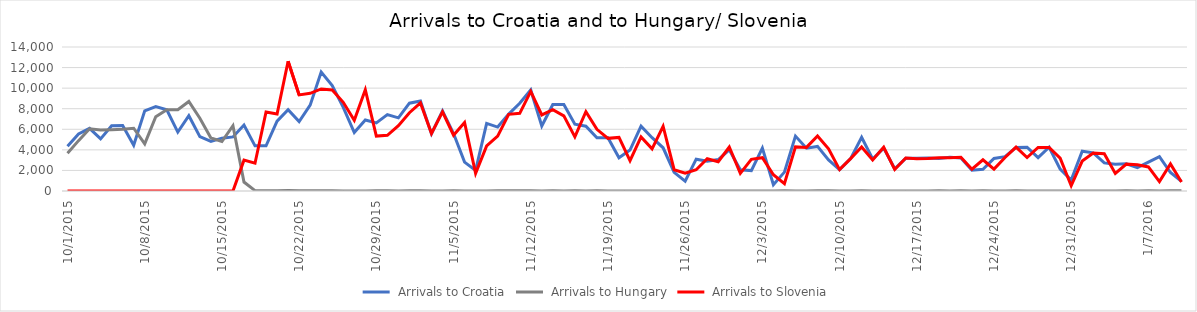
| Category | Arrivals to Croatia | Arrivals to Hungary | Arrivals to Slovenia |
|---|---|---|---|
| 10/1/15 | 4344 | 3667 | 0 |
| 10/2/15 | 5546 | 4897 | 0 |
| 10/3/15 | 6086 | 6056 | 0 |
| 10/4/15 | 5065 | 5925 | 0 |
| 10/5/15 | 6338 | 5952 | 0 |
| 10/6/15 | 6370 | 6000 | 0 |
| 10/7/15 | 4446 | 6103 | 0 |
| 10/8/15 | 7798 | 4583 | 6 |
| 10/9/15 | 8201 | 7215 | 0 |
| 10/10/15 | 7896 | 7907 | 0 |
| 10/11/15 | 5732 | 7897 | 0 |
| 10/12/15 | 7317 | 8702 | 0 |
| 10/13/15 | 5286 | 7081 | 0 |
| 10/14/15 | 4814 | 5157 | 0 |
| 10/15/15 | 5138 | 4808 | 0 |
| 10/16/15 | 5260 | 6353 | 0 |
| 10/17/15 | 6415 | 870 | 3000 |
| 10/18/15 | 4390 | 41 | 2700 |
| 10/19/15 | 4388 | 22 | 7677 |
| 10/20/15 | 6793 | 36 | 7478 |
| 10/21/15 | 7900 | 39 | 12616 |
| 10/22/15 | 6748 | 32 | 9339 |
| 10/23/15 | 8348 | 29 | 9500 |
| 10/24/15 | 11570 | 35 | 9925 |
| 10/25/15 | 10249 | 34 | 9818 |
| 10/26/15 | 8128 | 12 | 8625 |
| 10/27/15 | 5683 | 7 | 6877 |
| 10/28/15 | 6900 | 4 | 9848 |
| 10/29/15 | 6615 | 23 | 5341 |
| 10/30/15 | 7429 | 18 | 5409 |
| 10/31/15 | 7110 | 10 | 6344 |
| 11/1/15 | 8534 | 14 | 7611 |
| 11/2/15 | 8746 | 31 | 8568 |
| 11/3/15 | 5573 | 8 | 5591 |
| 11/4/15 | 7792 | 10 | 7693 |
| 11/5/15 | 5587 | 18 | 5426 |
| 11/6/15 | 2809 | 4 | 6655 |
| 11/7/15 | 2000 | 8 | 1716 |
| 11/8/15 | 6579 | 9 | 4381 |
| 11/9/15 | 6214 | 25 | 5341 |
| 11/10/15 | 7474 | 14 | 7457 |
| 11/11/15 | 8524 | 13 | 7554 |
| 11/12/15 | 9823 | 23 | 9681 |
| 11/13/15 | 6314 | 6 | 7397 |
| 11/14/15 | 8405 | 21 | 7905 |
| 11/15/15 | 8415 | 8 | 7300 |
| 11/16/15 | 6490 | 15 | 5261 |
| 11/17/15 | 6304 | 5 | 7704 |
| 11/18/15 | 5180 | 15 | 5998 |
| 11/19/15 | 5167 | 4 | 5119 |
| 11/20/15 | 3230 | 9 | 5211 |
| 11/21/15 | 3977 | 2 | 2952 |
| 11/22/15 | 6305 | 11 | 5260 |
| 11/23/15 | 5184 | 4 | 4102 |
| 11/24/15 | 4203 | 4 | 6297 |
| 11/25/15 | 1808 | 6 | 2070 |
| 11/26/15 | 952 | 10 | 1742 |
| 11/27/15 | 3095 | 2 | 2065 |
| 11/28/15 | 2886 | 6 | 3139 |
| 11/29/15 | 3060 | 3 | 2843 |
| 11/30/15 | 4009 | 7 | 4274 |
| 12/1/15 | 2066 | 4 | 1709 |
| 12/2/15 | 1982 | 4 | 3077 |
| 12/3/15 | 4174 | 9 | 3237 |
| 12/4/15 | 611 | 1 | 1577 |
| 12/5/15 | 1835 | 31 | 715 |
| 12/6/15 | 5339 | 7 | 4288 |
| 12/7/15 | 4162 | 0 | 4240 |
| 12/8/15 | 4335 | 13 | 5351 |
| 12/9/15 | 3027 | 14 | 4103 |
| 12/10/15 | 2076 | 3 | 2078 |
| 12/11/15 | 3149 | 0 | 3149 |
| 12/12/15 | 5225 | 13 | 4271 |
| 12/13/15 | 3112 | 10 | 3016 |
| 12/14/15 | 4174 | 3 | 4250 |
| 12/15/15 | 2160 | 2 | 2098 |
| 12/16/15 | 3177 | 6 | 3214 |
| 12/17/15 | 3192 | 0 | 3135 |
| 12/18/15 | 3200 | 11 | 3150 |
| 12/19/15 | 3156 | 31 | 3222 |
| 12/20/15 | 3276 | 8 | 3233 |
| 12/21/15 | 3210 | 25 | 3278 |
| 12/22/15 | 2027 | 1 | 2118 |
| 12/23/15 | 2116 | 21 | 3030 |
| 12/24/15 | 3166 | 8 | 2131 |
| 12/25/15 | 3339 | 2 | 3257 |
| 12/26/15 | 4241 | 17 | 4274 |
| 12/27/15 | 4251 | 10 | 3253 |
| 12/28/15 | 3249 | 0 | 4228 |
| 12/29/15 | 4253 | 0 | 4239 |
| 12/30/15 | 2132 | 11 | 3195 |
| 12/31/15 | 1058 | 5 | 511 |
| 1/1/16 | 3869 | 0 | 2914 |
| 1/2/16 | 3710 | 0 | 3690 |
| 1/3/16 | 2732 | 0 | 3619 |
| 1/4/16 | 2591 | 0 | 1708 |
| 1/5/16 | 2650 | 18 | 2626 |
| 1/6/16 | 2273 | 5 | 2550 |
| 1/7/16 | 2814 | 31 | 2337 |
| 1/8/16 | 3332 | 0 | 916 |
| 1/9/16 | 1799 | 15 | 2630 |
| 1/10/16 | 942 | 28 | 880 |